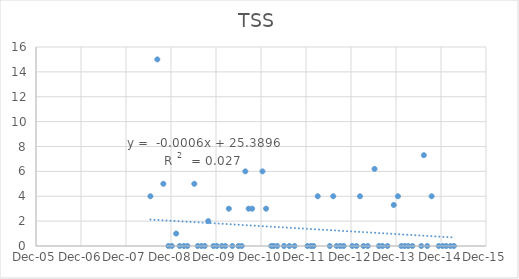
| Category | Series 0 |
|---|---|
| 39618.0 | 4 |
| 39674.0 | 15 |
| 39723.0 | 5 |
| 39764.0 | 0 |
| 39792.0 | 0 |
| 39827.0 | 1 |
| 39856.0 | 0 |
| 39890.0 | 0 |
| 39918.0 | 0 |
| 39974.0 | 5 |
| 40002.0 | 0 |
| 40031.0 | 0 |
| 40059.0 | 0 |
| 40087.0 | 2 |
| 40129.0 | 0 |
| 40157.0 | 0 |
| 40198.0 | 0 |
| 40226.0 | 0 |
| 40282.0 | 0 |
| 40254.0 | 3 |
| 40332.0 | 0 |
| 40359.0 | 0 |
| 40388.0 | 6 |
| 40415.0 | 3 |
| 40443.0 | 3 |
| 40527.0 | 6 |
| 40556.0 | 3 |
| 40598.0 | 0 |
| 40618.0 | 0 |
| 40646.0 | 0 |
| 40702.0 | 0 |
| 40745.0 | 0 |
| 40787.0 | 0 |
| 40892.0 | 0 |
| 40920.0 | 0 |
| 40941.0 | 0 |
| 40975.0 | 4 |
| 41073.0 | 0 |
| 41101.0 | 4 |
| 41129.0 | 0 |
| 41158.0 | 0 |
| 41186.0 | 0 |
| 41255.0 | 0 |
| 41290.0 | 0 |
| 41318.0 | 4 |
| 41346.0 | 0 |
| 41381.0 | 0 |
| 41436.0 | 6.2 |
| 41472.0 | 0 |
| 41500.0 | 0 |
| 41541.0 | 0 |
| 41592.0 | 3.3 |
| 41626.0 | 4 |
| 41653.0 | 0 |
| 41682.0 | 0 |
| 41709.0 | 0 |
| 41743.0 | 0 |
| 41815.0 | 0 |
| 41836.0 | 7.3 |
| 41863.0 | 0 |
| 41899.0 | 4 |
| 41957.0 | 0 |
| 41989.0 | 0 |
| 42017.0 | 0 |
| 42052.0 | 0 |
| 42080.0 | 0 |